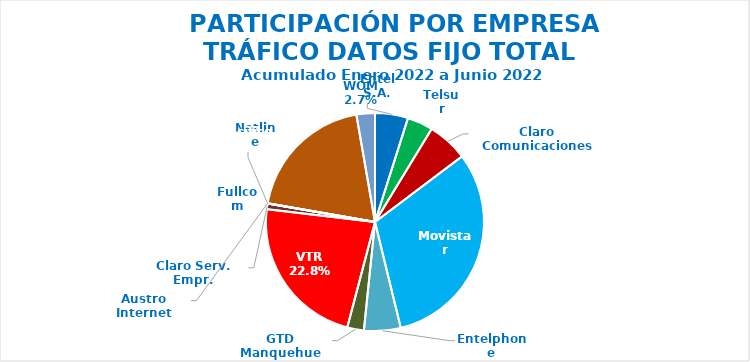
| Category | Series 0 |
|---|---|
| Entel S.A. | 573758.259 |
| Telsur | 446209.425 |
| Claro Comunicaciones | 705937.708 |
| Movistar | 3690982.93 |
| Entelphone | 636803.243 |
| GTD Manquehue | 290296.353 |
| VTR | 2669951.787 |
| Claro Serv. Empr. | 99788.626 |
| Fullcom | 221.713 |
| Netline | 2088.444 |
| Austro Internet | 81.336 |
| Mundo Pacífico | 2288995.792 |
| WOM | 321370.243 |